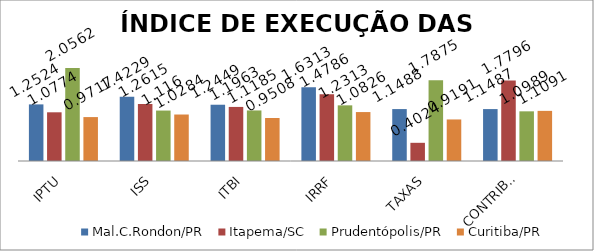
| Category | Mal.C.Rondon/PR | Itapema/SC | Prudentópolis/PR | Toledo/PR | Cascavel/PR | Curitiba/PR |
|---|---|---|---|---|---|---|
| IPTU | 1.252 | 1.077 | 2.056 |  |  | 0.972 |
| ISS | 1.423 | 1.262 | 1.116 |  |  | 1.028 |
| ITBI | 1.245 | 1.196 | 1.119 |  |  | 0.951 |
| IRRF | 1.631 | 1.479 | 1.231 |  |  | 1.083 |
| TAXAS | 1.149 | 0.402 | 1.788 |  |  | 0.919 |
| CONTRIBUIÇÕES | 1.149 | 1.78 | 1.099 |  |  | 1.109 |